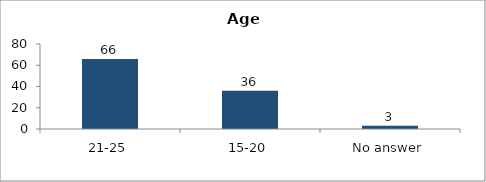
| Category | Age |
|---|---|
| 21-25 | 66 |
| 15-20 | 36 |
| No answer | 3 |